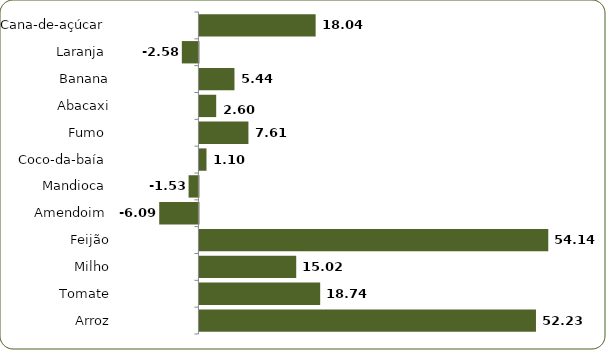
| Category | Series 0 |
|---|---|
| Cana-de-açúcar  | 18.036 |
| Laranja  | -2.576 |
| Banana | 5.438 |
| Abacaxi | 2.602 |
| Fumo  | 7.605 |
| Coco-da-baía  | 1.097 |
| Mandioca  | -1.529 |
| Amendoim  | -6.087 |
| Feijão | 54.143 |
| Milho | 15.024 |
| Tomate | 18.743 |
| Arroz | 52.235 |